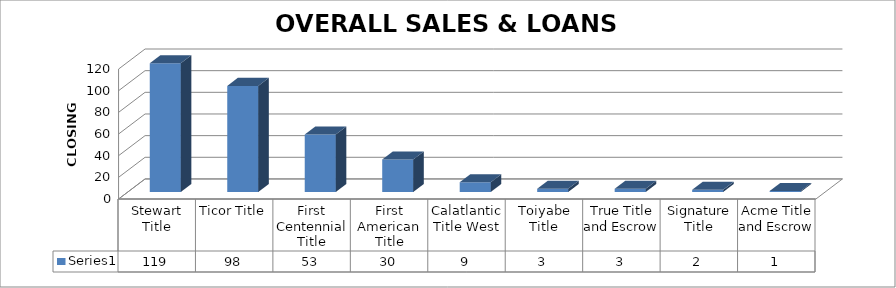
| Category | Series 0 |
|---|---|
| Stewart Title | 119 |
| Ticor Title | 98 |
| First Centennial Title | 53 |
| First American Title | 30 |
| Calatlantic Title West | 9 |
| Toiyabe Title | 3 |
| True Title and Escrow | 3 |
| Signature Title | 2 |
| Acme Title and Escrow | 1 |